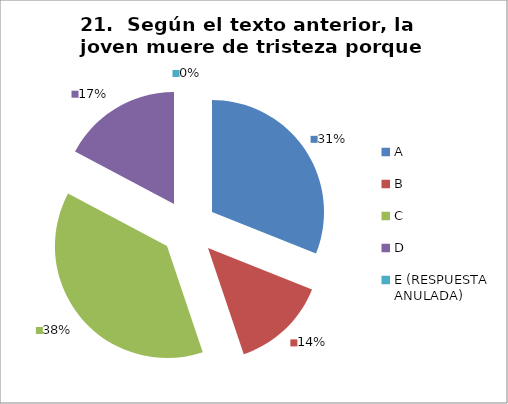
| Category | CANTIDAD DE RESPUESTAS PREGUNTA (21) | PORCENTAJE |
|---|---|---|
| A | 9 | 0.31 |
| B | 4 | 0.138 |
| C | 11 | 0.379 |
| D | 5 | 0.172 |
| E (RESPUESTA ANULADA) | 0 | 0 |